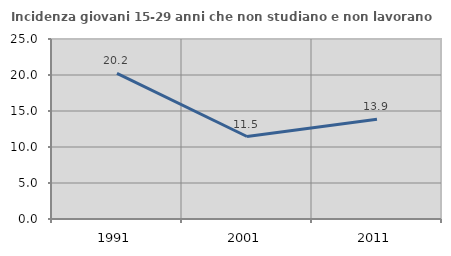
| Category | Incidenza giovani 15-29 anni che non studiano e non lavorano  |
|---|---|
| 1991.0 | 20.239 |
| 2001.0 | 11.458 |
| 2011.0 | 13.86 |